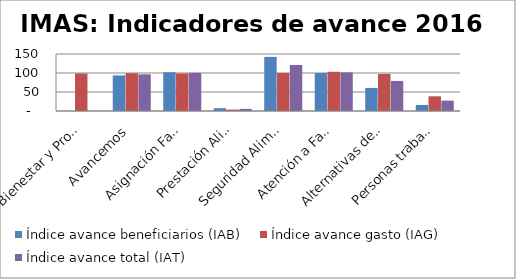
| Category | Índice avance beneficiarios (IAB)  | Índice avance gasto (IAG) | Índice avance total (IAT)  |
|---|---|---|---|
| Bienestar y Promocion Familiar | 0 | 98.592 | 0 |
| Avancemos | 93.65 | 99.335 | 96.493 |
| Asignación Familiar | 102.013 | 98.74 | 100.376 |
| Prestación Alimentaria | 7.389 | 3.745 | 5.567 |
| Seguridad Alimentaria | 142.383 | 99.932 | 121.157 |
| Atención a Familias | 100.004 | 103.204 | 101.604 |
| Alternativas de Cuido | 60.652 | 97.502 | 79.077 |
| Personas trabajadores menores de edad | 15.909 | 38.68 | 27.295 |